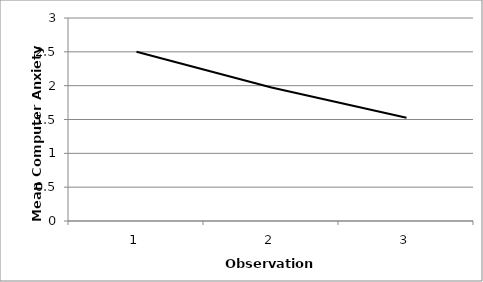
| Category | Series 0 |
|---|---|
| 0 | 2.5 |
| 1 | 1.973 |
| 2 | 1.527 |